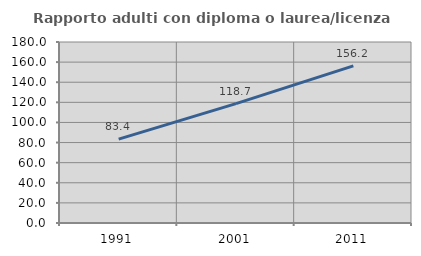
| Category | Rapporto adulti con diploma o laurea/licenza media  |
|---|---|
| 1991.0 | 83.42 |
| 2001.0 | 118.692 |
| 2011.0 | 156.235 |